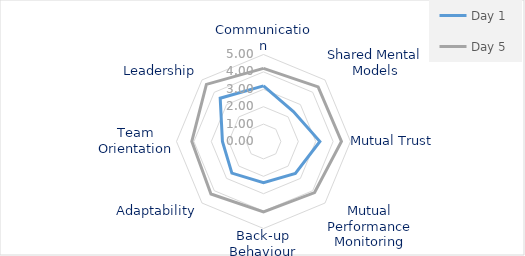
| Category | Day 1 | Day 5 |
|---|---|---|
| Communication | 3.2 | 4.2 |
| Shared Mental Models | 2.43 | 4.44 |
| Mutual Trust | 3.24 | 4.48 |
| Mutual Performance Monitoring | 2.59 | 4.15 |
| Back-up Behaviour | 2.37 | 4.04 |
| Adaptability | 2.57 | 4.27 |
| Team Orientation | 2.36 | 4.12 |
| Leadership | 3.52 | 4.64 |